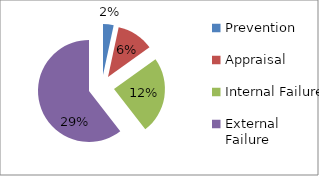
| Category | Series 0 |
|---|---|
| Prevention | 0.016 |
| Appraisal | 0.056 |
| Internal Failure | 0.116 |
| External Failure | 0.288 |